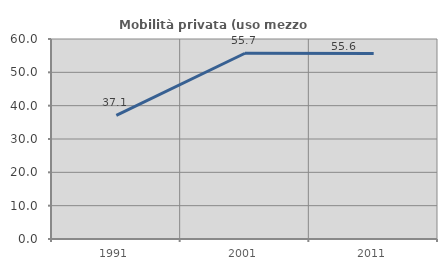
| Category | Mobilità privata (uso mezzo privato) |
|---|---|
| 1991.0 | 37.114 |
| 2001.0 | 55.73 |
| 2011.0 | 55.631 |